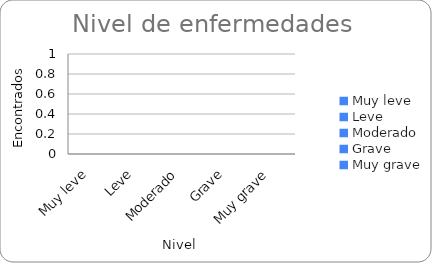
| Category | Series 0 |
|---|---|
| Muy leve | 0 |
| Leve | 0 |
| Moderado | 0 |
| Grave | 0 |
| Muy grave | 0 |